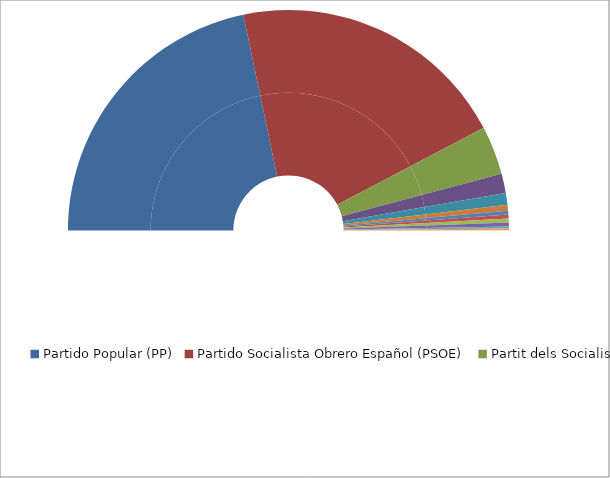
| Category | Series 0 | Series 1 |
|---|---|---|
| Partido Popular (PP) | 152 | 43.42 |
| Partido Socialista Obrero Español (PSOE) | 144 | 41.14 |
| Partit dels Socialistes de Catalunya (PSC-PSOE) | 25 | 7.14 |
| Convergencia i Unió (CiU) | 10 | 2.85 |
| Euzko Alderdi Jeltzalea-Partido Nacionalista Vasco (EAJ-PNV) | 6 | 1.71 |
| Esquerra Republicana de Catalunya (ERC)  | 3 | 0.85 |
| Izquierda Unida (IU) | 2 | 0.57 |
| Bloque Nacionalista Galego (BNG) | 2 | 0.57 |
| Coalición Canaria - Partido Nacionalista Canario (CC-PNC) | 2 | 0.57 |
| Unión del Pueblo Navarro-Partido Popular (UPN-PP) | 2 | 0.57 |
| Unión, Progreso y Democracia (UPyD) | 1 | 0.28 |
| Coalición Nafarroa Bai (NA-BAI) | 1 | 0.28 |